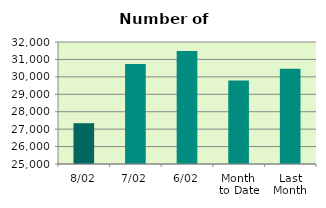
| Category | Series 0 |
|---|---|
| 8/02 | 27340 |
| 7/02 | 30736 |
| 6/02 | 31482 |
| Month 
to Date | 29785 |
| Last
Month | 30462.455 |